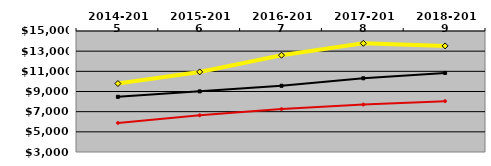
| Category | NATIONAL MEDIAN | WEST MEDIAN | TEXAS LUTHERAN |
|---|---|---|---|
| 2014-2015 | 8473.314 | 5882.501 | 9792.02 |
| 2015-2016 | 9013.486 | 6644.568 | 10943.363 |
| 2016-2017 | 9566.64 | 7255.571 | 12600.824 |
| 2017-2018 | 10311.147 | 7704.307 | 13775.86 |
| 2018-2019 | 10842.044 | 8044.239 | 13520.988 |